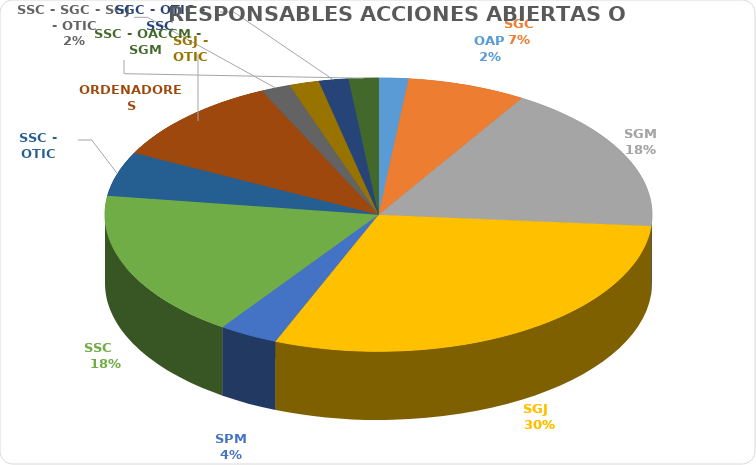
| Category | Series 0 |
|---|---|
| OAP | 1 |
| SGC | 4 |
| SGM | 10 |
| SGJ   | 17 |
| SPM | 2 |
| SSC    | 10 |
| SSC - OTIC | 3 |
| ORDENADORES | 6 |
| SSC - SGC - SGJ - OTIC | 1 |
| SGJ - OTIC | 1 |
| SGC - OTIC - SSC | 1 |
| SSC - OACCM - SGM  | 1 |